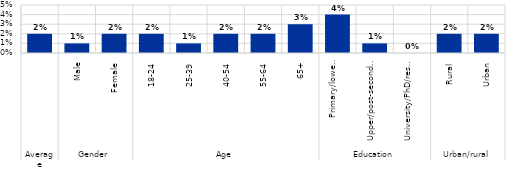
| Category | Series 0 |
|---|---|
| 0 | 0.02 |
| 1 | 0.01 |
| 2 | 0.02 |
| 3 | 0.02 |
| 4 | 0.01 |
| 5 | 0.02 |
| 6 | 0.02 |
| 7 | 0.03 |
| 8 | 0.04 |
| 9 | 0.01 |
| 10 | 0 |
| 11 | 0.02 |
| 12 | 0.02 |